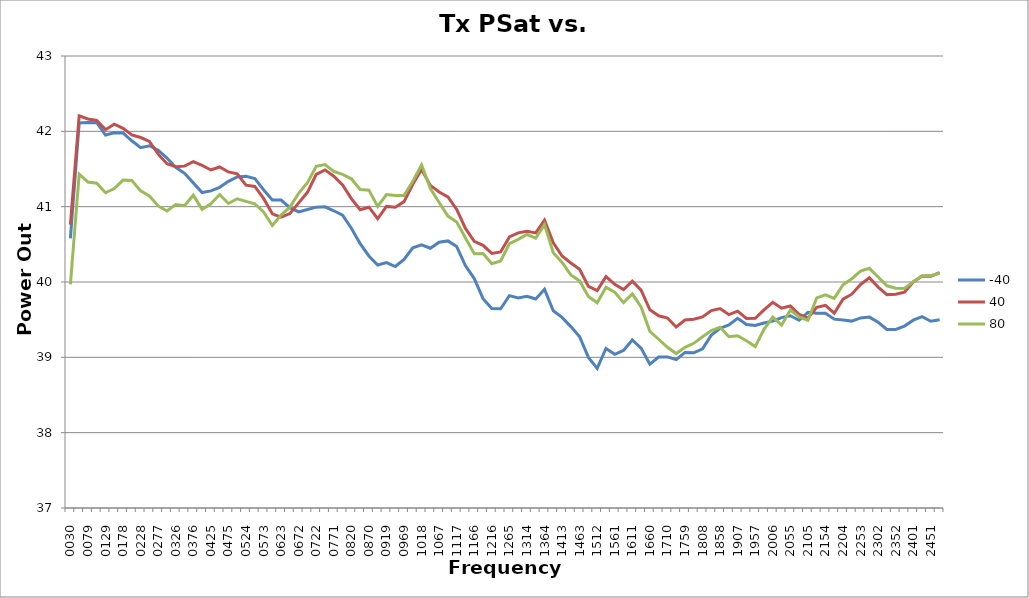
| Category | -40 | 40 | 80 |
|---|---|---|---|
| 30.0 | 40.58 | 40.762 | 39.967 |
| 54.7 | 42.11 | 42.205 | 41.433 |
| 79.4 | 42.119 | 42.164 | 41.327 |
| 104.10000000000001 | 42.114 | 42.144 | 41.311 |
| 128.8 | 41.951 | 42.022 | 41.184 |
| 153.5 | 41.98 | 42.096 | 41.241 |
| 178.2 | 41.977 | 42.04 | 41.353 |
| 202.89999999999998 | 41.874 | 41.952 | 41.347 |
| 227.59999999999997 | 41.783 | 41.918 | 41.21 |
| 252.29999999999995 | 41.809 | 41.865 | 41.143 |
| 276.99999999999994 | 41.749 | 41.697 | 41.01 |
| 301.69999999999993 | 41.646 | 41.571 | 40.943 |
| 326.3999999999999 | 41.523 | 41.531 | 41.028 |
| 351.0999999999999 | 41.442 | 41.538 | 41.012 |
| 375.7999999999999 | 41.316 | 41.599 | 41.153 |
| 400.4999999999999 | 41.187 | 41.547 | 40.964 |
| 425.1999999999999 | 41.21 | 41.487 | 41.038 |
| 449.89999999999986 | 41.257 | 41.527 | 41.161 |
| 474.59999999999985 | 41.336 | 41.461 | 41.042 |
| 499.29999999999984 | 41.395 | 41.436 | 41.105 |
| 523.9999999999999 | 41.405 | 41.285 | 41.07 |
| 548.6999999999999 | 41.375 | 41.268 | 41.039 |
| 573.4 | 41.225 | 41.109 | 40.931 |
| 598.1 | 41.089 | 40.905 | 40.751 |
| 622.8000000000001 | 41.088 | 40.862 | 40.889 |
| 647.5000000000001 | 40.987 | 40.908 | 40.993 |
| 672.2000000000002 | 40.931 | 41.051 | 41.178 |
| 696.9000000000002 | 40.963 | 41.19 | 41.318 |
| 721.6000000000003 | 40.994 | 41.429 | 41.535 |
| 746.3000000000003 | 40.997 | 41.488 | 41.559 |
| 771.0000000000003 | 40.946 | 41.404 | 41.469 |
| 795.7000000000004 | 40.888 | 41.287 | 41.428 |
| 820.4000000000004 | 40.714 | 41.106 | 41.37 |
| 845.1000000000005 | 40.51 | 40.959 | 41.227 |
| 869.8000000000005 | 40.345 | 40.993 | 41.219 |
| 894.5000000000006 | 40.226 | 40.84 | 41.003 |
| 919.2000000000006 | 40.257 | 41.004 | 41.161 |
| 943.9000000000007 | 40.205 | 40.993 | 41.147 |
| 968.6000000000007 | 40.299 | 41.067 | 41.149 |
| 993.3000000000008 | 40.454 | 41.298 | 41.339 |
| 1018.0000000000008 | 40.493 | 41.494 | 41.554 |
| 1042.7000000000007 | 40.449 | 41.283 | 41.241 |
| 1067.4000000000008 | 40.528 | 41.194 | 41.056 |
| 1092.1000000000008 | 40.545 | 41.129 | 40.875 |
| 1116.8000000000009 | 40.47 | 40.963 | 40.796 |
| 1141.500000000001 | 40.215 | 40.711 | 40.584 |
| 1166.200000000001 | 40.046 | 40.539 | 40.376 |
| 1190.900000000001 | 39.779 | 40.486 | 40.377 |
| 1215.600000000001 | 39.649 | 40.38 | 40.242 |
| 1240.300000000001 | 39.645 | 40.4 | 40.279 |
| 1265.0000000000011 | 39.819 | 40.599 | 40.508 |
| 1289.7000000000012 | 39.787 | 40.652 | 40.566 |
| 1314.4000000000012 | 39.811 | 40.672 | 40.631 |
| 1339.1000000000013 | 39.774 | 40.652 | 40.581 |
| 1363.8000000000013 | 39.902 | 40.821 | 40.762 |
| 1388.5000000000014 | 39.618 | 40.519 | 40.388 |
| 1413.2000000000014 | 39.53 | 40.345 | 40.259 |
| 1437.9000000000015 | 39.408 | 40.252 | 40.093 |
| 1462.6000000000015 | 39.274 | 40.169 | 40.014 |
| 1487.3000000000015 | 38.999 | 39.942 | 39.808 |
| 1512.0000000000016 | 38.853 | 39.886 | 39.724 |
| 1536.7000000000016 | 39.118 | 40.071 | 39.929 |
| 1561.4000000000017 | 39.04 | 39.969 | 39.865 |
| 1586.1000000000017 | 39.092 | 39.899 | 39.726 |
| 1610.8000000000018 | 39.23 | 40.011 | 39.843 |
| 1635.5000000000018 | 39.123 | 39.891 | 39.668 |
| 1660.2000000000019 | 38.91 | 39.631 | 39.345 |
| 1684.900000000002 | 39.005 | 39.552 | 39.24 |
| 1709.600000000002 | 39.006 | 39.522 | 39.133 |
| 1734.300000000002 | 38.969 | 39.403 | 39.05 |
| 1759.000000000002 | 39.065 | 39.495 | 39.133 |
| 1783.700000000002 | 39.06 | 39.505 | 39.186 |
| 1808.4000000000021 | 39.114 | 39.536 | 39.273 |
| 1833.1000000000022 | 39.295 | 39.62 | 39.355 |
| 1857.8000000000022 | 39.386 | 39.647 | 39.398 |
| 1882.5000000000023 | 39.43 | 39.567 | 39.273 |
| 1907.2000000000023 | 39.517 | 39.613 | 39.286 |
| 1931.9000000000024 | 39.436 | 39.516 | 39.221 |
| 1956.6000000000024 | 39.422 | 39.519 | 39.143 |
| 1981.3000000000025 | 39.455 | 39.631 | 39.371 |
| 2006.0000000000025 | 39.481 | 39.73 | 39.534 |
| 2030.7000000000025 | 39.528 | 39.653 | 39.427 |
| 2055.4000000000024 | 39.552 | 39.681 | 39.627 |
| 2080.100000000002 | 39.492 | 39.572 | 39.537 |
| 2104.800000000002 | 39.597 | 39.521 | 39.493 |
| 2129.500000000002 | 39.584 | 39.665 | 39.788 |
| 2154.2000000000016 | 39.586 | 39.69 | 39.828 |
| 2178.9000000000015 | 39.507 | 39.586 | 39.783 |
| 2203.6000000000013 | 39.496 | 39.772 | 39.963 |
| 2228.300000000001 | 39.481 | 39.838 | 40.044 |
| 2253.000000000001 | 39.523 | 39.967 | 40.144 |
| 2277.7000000000007 | 39.534 | 40.057 | 40.182 |
| 2302.4000000000005 | 39.466 | 39.933 | 40.067 |
| 2327.1000000000004 | 39.37 | 39.833 | 39.95 |
| 2351.8 | 39.37 | 39.838 | 39.917 |
| 2376.5 | 39.415 | 39.865 | 39.913 |
| 2401.2 | 39.493 | 40.001 | 40.003 |
| 2425.8999999999996 | 39.539 | 40.08 | 40.08 |
| 2450.5999999999995 | 39.479 | 40.077 | 40.085 |
| 2475.2999999999993 | 39.498 | 40.124 | 40.116 |